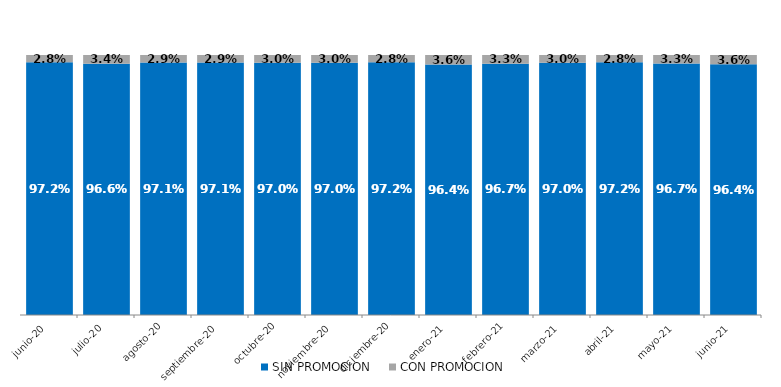
| Category | SIN PROMOCION   | CON PROMOCION   |
|---|---|---|
| 2020-06-01 | 0.972 | 0.028 |
| 2020-07-01 | 0.966 | 0.034 |
| 2020-08-01 | 0.971 | 0.029 |
| 2020-09-01 | 0.971 | 0.029 |
| 2020-10-01 | 0.97 | 0.03 |
| 2020-11-01 | 0.97 | 0.03 |
| 2020-12-01 | 0.972 | 0.028 |
| 2021-01-01 | 0.964 | 0.036 |
| 2021-02-01 | 0.967 | 0.033 |
| 2021-03-01 | 0.97 | 0.03 |
| 2021-04-01 | 0.972 | 0.028 |
| 2021-05-01 | 0.967 | 0.033 |
| 2021-06-01 | 0.964 | 0.036 |